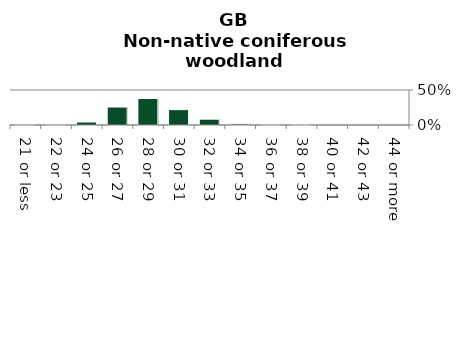
| Category | Non-native coniferous woodland |
|---|---|
| 21 or less | 0 |
| 22 or 23 | 0.002 |
| 24 or 25 | 0.043 |
| 26 or 27 | 0.257 |
| 28 or 29 | 0.378 |
| 30 or 31 | 0.22 |
| 32 or 33 | 0.083 |
| 34 or 35 | 0.016 |
| 36 or 37 | 0.002 |
| 38 or 39 | 0 |
| 40 or 41 | 0 |
| 42 or 43 | 0 |
| 44 or more | 0 |